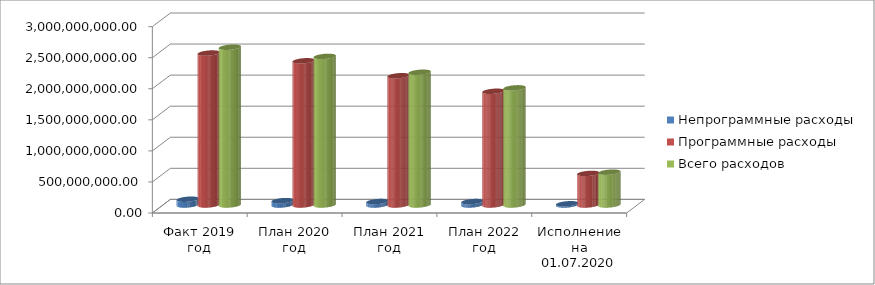
| Category | Непрограммные расходы | Программные расходы | Всего расходов |
|---|---|---|---|
| Факт 2019 год | 93276865.45 | 2446468858.11 | 2539745723.56 |
| План 2020 год | 70348917 | 2321806868.78 | 2392155785.78 |
| План 2021 год | 55666960 | 2081131963.8 | 2136798923.8 |
| План 2022 год | 55245660 | 1830728605.1 | 1885974265.1 |
| Исполнение на 01.07.2020 года | 20070924.9 | 508520801.51 | 528591726.41 |